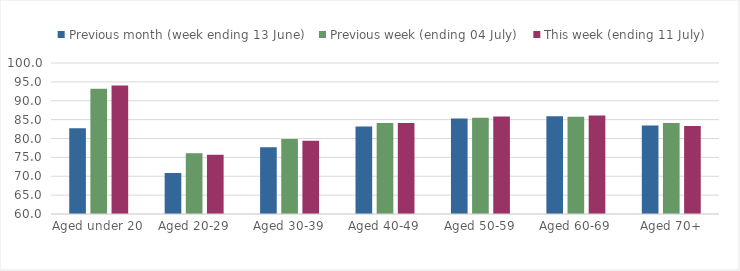
| Category | Previous month (week ending 13 June) | Previous week (ending 04 July) | This week (ending 11 July) |
|---|---|---|---|
| Aged under 20 | 82.696 | 93.167 | 94.036 |
| Aged 20-29 | 70.862 | 76.11 | 75.687 |
| Aged 30-39 | 77.65 | 79.844 | 79.384 |
| Aged 40-49 | 83.205 | 84.079 | 84.103 |
| Aged 50-59 | 85.276 | 85.501 | 85.841 |
| Aged 60-69 | 85.885 | 85.748 | 86.087 |
| Aged 70+ | 83.426 | 84.086 | 83.317 |